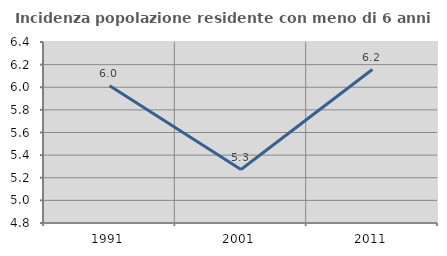
| Category | Incidenza popolazione residente con meno di 6 anni |
|---|---|
| 1991.0 | 6.013 |
| 2001.0 | 5.273 |
| 2011.0 | 6.156 |